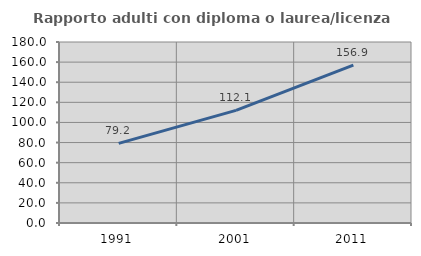
| Category | Rapporto adulti con diploma o laurea/licenza media  |
|---|---|
| 1991.0 | 79.2 |
| 2001.0 | 112.057 |
| 2011.0 | 156.923 |